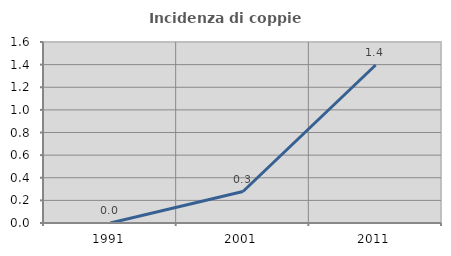
| Category | Incidenza di coppie miste |
|---|---|
| 1991.0 | 0 |
| 2001.0 | 0.278 |
| 2011.0 | 1.396 |